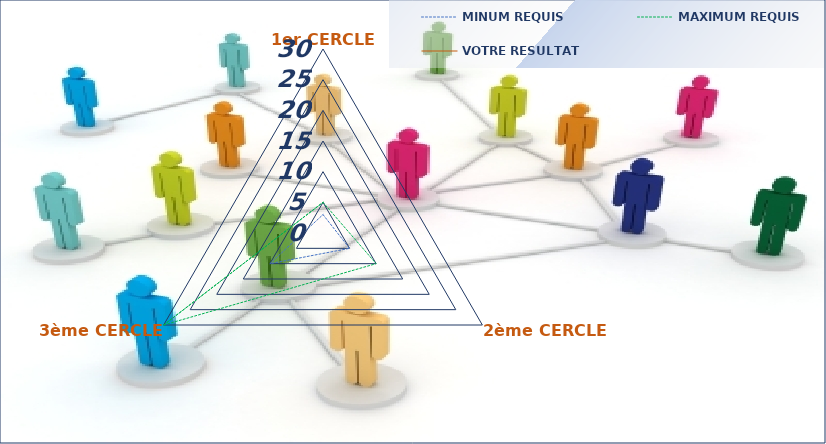
| Category | MINUM REQUIS | MAXIMUM REQUIS | VOTRE RESULTAT |
|---|---|---|---|
| 1er CERCLE  | 3 | 5 | 0 |
| 2ème CERCLE  | 5 | 10 | 0 |
| 3ème CERCLE  | 10 | 30 | 0 |